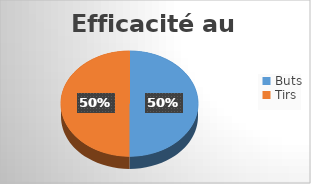
| Category | Series 0 |
|---|---|
| Buts | 50 |
| Tirs | 50 |